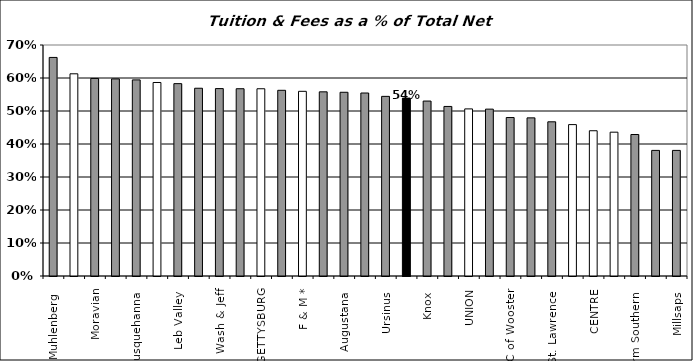
| Category | T&F |
|---|---|
| Muhlenberg  | 0.662 |
| WHITMAN | 0.613 |
| Moravian | 0.599 |
| Lycoming  | 0.597 |
| Susquehanna  | 0.594 |
| KENYON | 0.586 |
| Leb Valley  | 0.583 |
| Elizabethtown  | 0.569 |
| Wash & Jeff | 0.568 |
| Wittenberg  | 0.568 |
| GETTYSBURG | 0.567 |
| Allegheny  | 0.563 |
| F & M * | 0.56 |
| Drew  | 0.558 |
| Augustana  | 0.557 |
| McDaniel  | 0.555 |
| Ursinus  | 0.544 |
| Juniata  | 0.539 |
| Knox  | 0.53 |
| Washington  | 0.514 |
| UNION | 0.506 |
| Westminster  | 0.506 |
| C of Wooster | 0.48 |
| Wofford  | 0.479 |
| St. Lawrence  | 0.467 |
| SEWANEE | 0.459 |
| CENTRE | 0.44 |
| DICKINSON | 0.436 |
| Birm Southern  | 0.429 |
| Presbyterian  | 0.381 |
| Millsaps  | 0.381 |